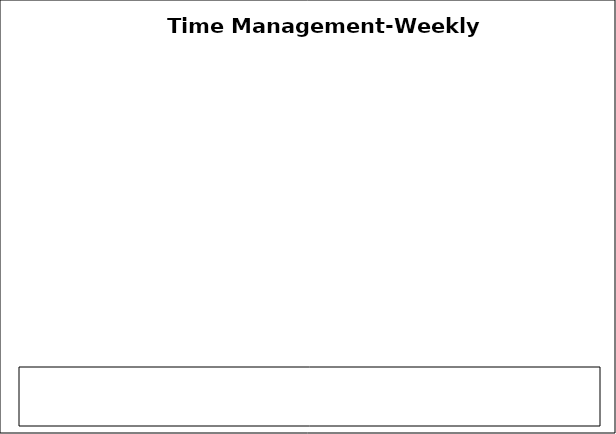
| Category | Series 0 |
|---|---|
| Work hours | 0 |
| Travelling time | 0 |
| Quality family time | 0 |
| TV/Reading | 0 |
| Socialising | 0 |
| Housework/Gardening | 0 |
| Shopping | 0 |
| Exercise/Health | 0 |
| Eating | 0 |
| Sleeping | 0 |
| Other | 0 |